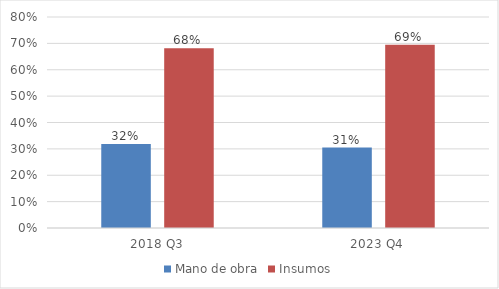
| Category | Mano de obra | Insumos |
|---|---|---|
| 2018 Q3 | 0.319 | 0.681 |
| 2023 Q4 | 0.305 | 0.695 |